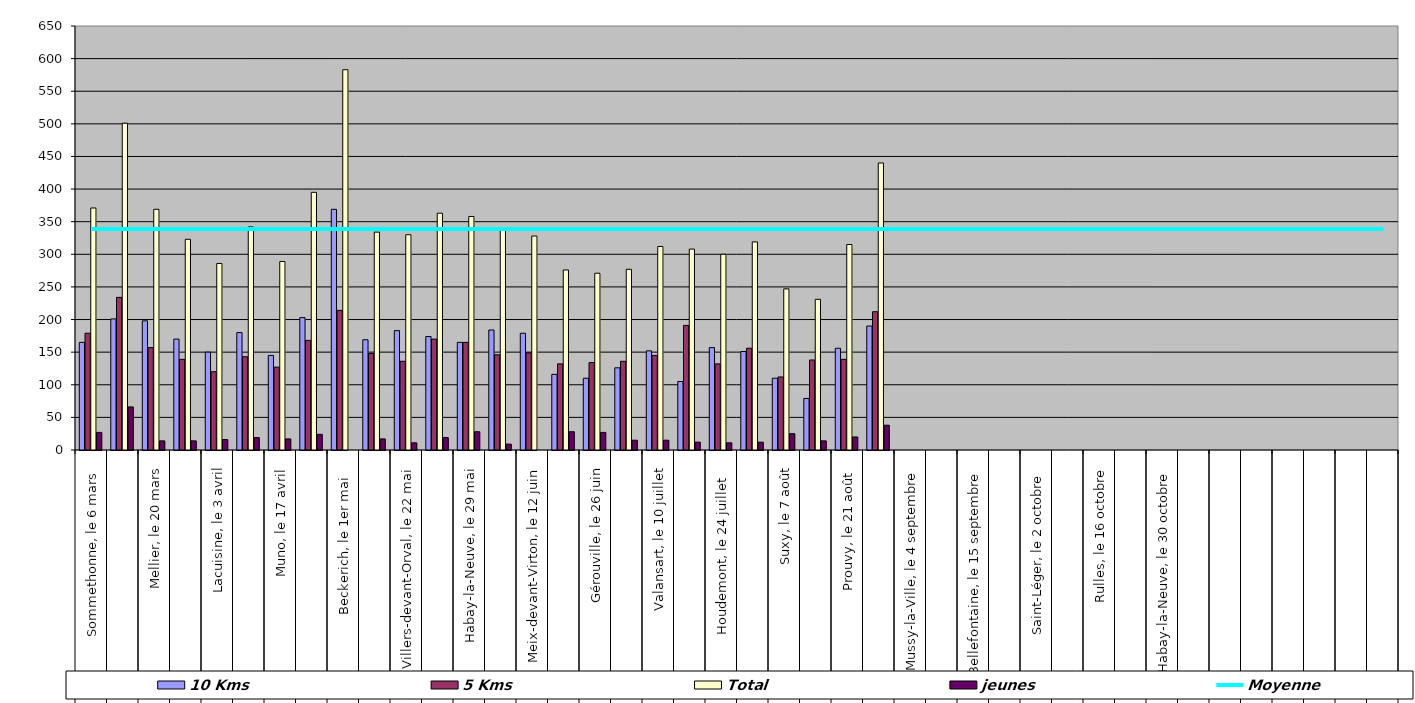
| Category | 10 Kms | 5 Kms | Total | jeunes |
|---|---|---|---|---|
| 0 | 165 | 179 | 371 | 27 |
| 1 | 201 | 234 | 501 | 66 |
| 2 | 198 | 157 | 369 | 14 |
| 3 | 170 | 139 | 323 | 14 |
| 4 | 150 | 120 | 286 | 16 |
| 5 | 180 | 143 | 342 | 19 |
| 6 | 145 | 127 | 289 | 17 |
| 7 | 203 | 168 | 395 | 24 |
| 8 | 369 | 214 | 583 | 0 |
| 9 | 169 | 148 | 334 | 17 |
| 10 | 183 | 136 | 330 | 11 |
| 11 | 174 | 170 | 363 | 19 |
| 12 | 165 | 165 | 358 | 28 |
| 13 | 184 | 146 | 339 | 9 |
| 14 | 179 | 149 | 328 | 0 |
| 15 | 116 | 132 | 276 | 28 |
| 16 | 110 | 134 | 271 | 27 |
| 17 | 126 | 136 | 277 | 15 |
| 18 | 152 | 145 | 312 | 15 |
| 19 | 105 | 191 | 308 | 12 |
| 20 | 157 | 132 | 300 | 11 |
| 21 | 151 | 156 | 319 | 12 |
| 22 | 110 | 112 | 247 | 25 |
| 23 | 79 | 138 | 231 | 14 |
| 24 | 156 | 139 | 315 | 20 |
| 25 | 190 | 212 | 440 | 38 |
| 26 | 0 | 0 | 0 | 0 |
| 27 | 0 | 0 | 0 | 0 |
| 28 | 0 | 0 | 0 | 0 |
| 29 | 0 | 0 | 0 | 0 |
| 30 | 0 | 0 | 0 | 0 |
| 31 | 0 | 0 | 0 | 0 |
| 32 | 0 | 0 | 0 | 0 |
| 33 | 0 | 0 | 0 | 0 |
| 34 | 0 | 0 | 0 | 0 |
| 35 | 0 | 0 | 0 | 0 |
| 36 | 0 | 0 | 0 | 0 |
| 37 | 0 | 0 | 0 | 0 |
| 38 | 0 | 0 | 0 | 0 |
| 39 | 0 | 0 | 0 | 0 |
| 40 | 0 | 0 | 0 | 0 |
| 41 | 0 | 0 | 0 | 0 |